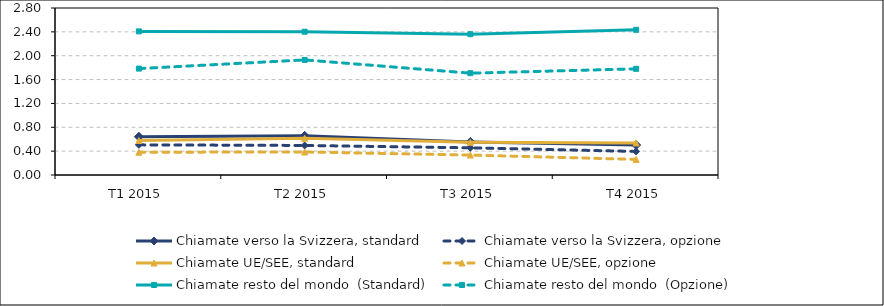
| Category | Chiamate verso la Svizzera, standard | Chiamate verso la Svizzera, opzione | Chiamate UE/SEE, standard | Chiamate UE/SEE, opzione | Chiamate resto del mondo  (Standard) | Chiamate resto del mondo  (Opzione) |
|---|---|---|---|---|---|---|
| T1 2015 | 0.642 | 0.505 | 0.578 | 0.382 | 2.408 | 1.784 |
| T2 2015 | 0.657 | 0.495 | 0.616 | 0.386 | 2.402 | 1.93 |
| T3 2015 | 0.554 | 0.456 | 0.547 | 0.334 | 2.361 | 1.708 |
| T4 2015 | 0.503 | 0.395 | 0.537 | 0.262 | 2.434 | 1.78 |